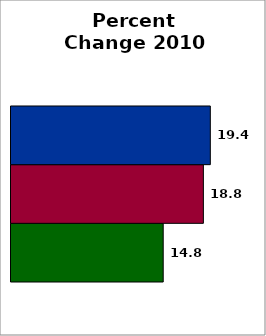
| Category | School | SREB states (average) | 50 states and D.C. (average) |
|---|---|---|---|
| 0 | 14.849 | 18.769 | 19.447 |